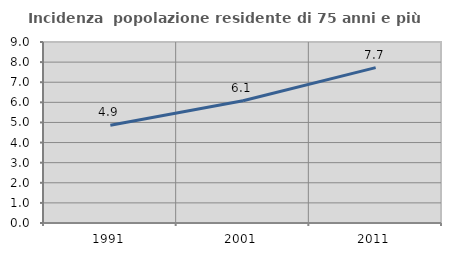
| Category | Incidenza  popolazione residente di 75 anni e più |
|---|---|
| 1991.0 | 4.863 |
| 2001.0 | 6.082 |
| 2011.0 | 7.727 |